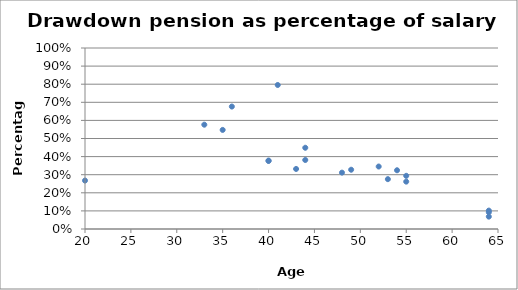
| Category | Drawdown |
|---|---|
| 40.0 | 0.378 |
| 64.0 | 0.102 |
| 33.0 | 0.576 |
| 20.0 | 0.268 |
| 44.0 | 0.381 |
| 48.0 | 0.311 |
| 44.0 | 0.449 |
| 64.0 | 0.092 |
| 53.0 | 0.275 |
| 52.0 | 0.345 |
| 55.0 | 0.262 |
| 64.0 | 0.068 |
| 35.0 | 0.547 |
| 41.0 | 0.796 |
| 55.0 | 0.294 |
| 36.0 | 0.677 |
| 43.0 | 0.332 |
| 40.0 | 0.376 |
| 49.0 | 0.327 |
| 54.0 | 0.325 |